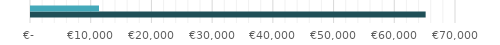
| Category | Series 0 | Series 1 |
|---|---|---|
| 0 | 65000 | 11200 |